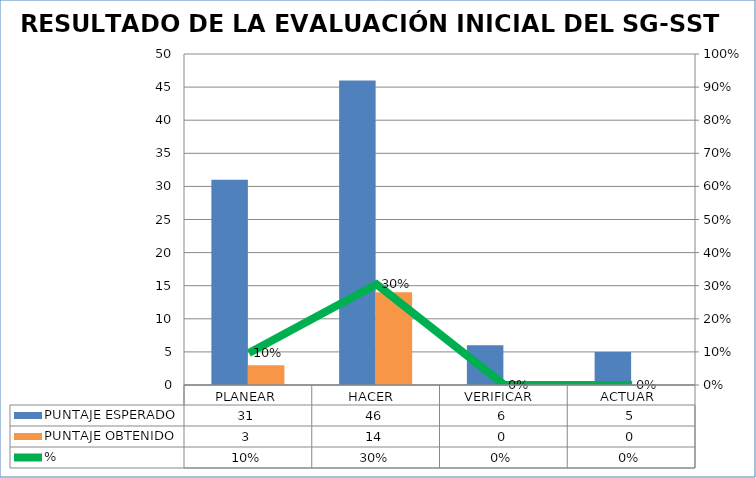
| Category | PUNTAJE ESPERADO  | PUNTAJE OBTENIDO  |
|---|---|---|
| PLANEAR | 31 | 3 |
| HACER  | 46 | 14 |
| VERIFICAR  | 6 | 0 |
| ACTUAR  | 5 | 0 |